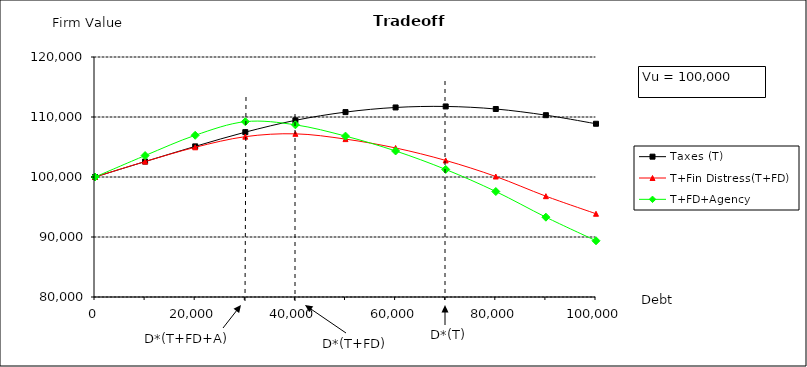
| Category | Taxes (T) | T+Fin Distress(T+FD) | T+FD+Agency |
|---|---|---|---|
| 0.0 | 100000 | 100000 | 100000 |
| 10000.0 | 102571.429 | 102571.429 | 103571.429 |
| 20000.0 | 105102.857 | 104952.857 | 106952.857 |
| 30000.0 | 107474.286 | 106724.286 | 109224.286 |
| 40000.0 | 109445.714 | 107195.714 | 108695.714 |
| 50000.0 | 110817.143 | 106317.143 | 106817.143 |
| 60000.0 | 111588.571 | 104838.571 | 104338.571 |
| 70000.0 | 111760 | 102760 | 101260 |
| 80000.0 | 111331.429 | 100081.429 | 97581.429 |
| 90000.0 | 110302.857 | 96802.857 | 93302.857 |
| 100000.0 | 108874.286 | 93874.286 | 89374.286 |